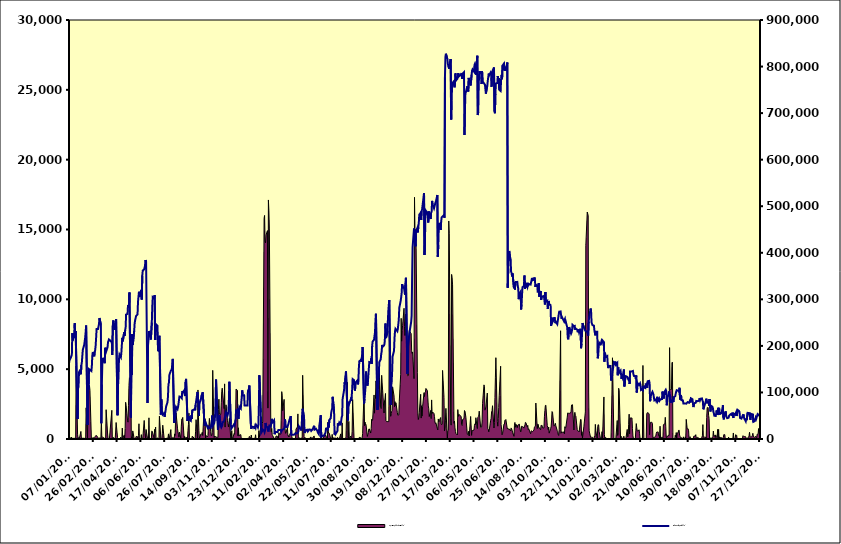
| Category | Deposit Facility (RHS) |
|---|---|
| 31/12/2009 | 162117 |
| 04/01/2010 | 168760 |
| 05/01/2010 | 175174 |
| 06/01/2010 | 176135 |
| 07/01/2010 | 181435 |
| 08/01/2010 | 227141 |
| 11/01/2010 | 211743 |
| 12/01/2010 | 227612 |
| 13/01/2010 | 248874 |
| 14/01/2010 | 217447 |
| 15/01/2010 | 232147 |
| 18/01/2010 | 231439 |
| 19/01/2010 | 42909 |
| 20/01/2010 | 108824 |
| 21/01/2010 | 112060 |
| 22/01/2010 | 143074 |
| 25/01/2010 | 145376 |
| 26/01/2010 | 138953 |
| 27/01/2010 | 158878 |
| 28/01/2010 | 164795 |
| 29/01/2010 | 165261 |
| 01/02/2010 | 191474 |
| 02/02/2010 | 202456 |
| 03/02/2010 | 210273 |
| 04/02/2010 | 217706 |
| 05/02/2010 | 229364 |
| 08/02/2010 | 243711 |
| 09/02/2010 | 29908 |
| 10/02/2010 | 114173 |
| 11/02/2010 | 106587 |
| 12/02/2010 | 150113 |
| 15/02/2010 | 149724 |
| 16/02/2010 | 149724 |
| 17/02/2010 | 146036 |
| 18/02/2010 | 156482 |
| 19/02/2010 | 178934 |
| 20/02/2010 | 186977 |
| 23/02/2010 | 177595 |
| 24/02/2010 | 186103 |
| 25/02/2010 | 190885 |
| 26/02/2010 | 200770 |
| 01/03/2010 | 217292 |
| 02/03/2010 | 236470 |
| 03/03/2010 | 236470 |
| 04/03/2010 | 241774 |
| 05/03/2010 | 246718 |
| 06/03/2010 | 259759 |
| 09/03/2010 | 245483 |
| 10/03/2010 | 33867 |
| 11/03/2010 | 116960 |
| 12/03/2010 | 160313 |
| 15/03/2010 | 172308 |
| 16/03/2010 | 172320 |
| 17/03/2010 | 162805 |
| 18/03/2010 | 196014 |
| 19/03/2010 | 195139 |
| 22/03/2010 | 187838 |
| 23/03/2010 | 197126 |
| 24/03/2010 | 208103 |
| 25/03/2010 | 207308 |
| 26/03/2010 | 213936 |
| 29/03/2010 | 212162 |
| 30/03/2010 | 207952 |
| 31/03/2010 | 180284 |
| 01/04/2010 | 242659 |
| 02/04/2010 | 254701 |
| 07/04/2010 | 234551 |
| 08/04/2010 | 234142 |
| 09/04/2010 | 249292 |
| 10/04/2010 | 257710 |
| 13/04/2010 | 50875 |
| 14/04/2010 | 113660 |
| 15/04/2010 | 132661 |
| 16/04/2010 | 171115 |
| 19/04/2010 | 181469 |
| 20/04/2010 | 175446 |
| 21/04/2010 | 185147 |
| 22/04/2010 | 186741 |
| 23/04/2010 | 217364 |
| 26/04/2010 | 209733 |
| 27/04/2010 | 229501 |
| 28/04/2010 | 221743 |
| 29/04/2010 | 233373 |
| 30/04/2010 | 240120 |
| 03/05/2010 | 267250 |
| 04/05/2010 | 268670 |
| 05/05/2010 | 288019 |
| 06/05/2010 | 290009 |
| 07/05/2010 | 282014 |
| 10/05/2010 | 314792 |
| 11/05/2010 | 46375 |
| 12/05/2010 | 145743 |
| 13/05/2010 | 138058 |
| 14/05/2010 | 225607 |
| 17/05/2010 | 202200 |
| 18/05/2010 | 232148 |
| 19/05/2010 | 248833 |
| 20/05/2010 | 255100 |
| 21/05/2010 | 253469 |
| 24/05/2010 | 264484 |
| 25/05/2010 | 267598 |
| 26/05/2010 | 294533 |
| 27/05/2010 | 305432 |
| 28/05/2010 | 316163 |
| 31/05/2010 | 305232 |
| 01/06/2010 | 316405 |
| 02/06/2010 | 320367 |
| 03/06/2010 | 299471 |
| 04/06/2010 | 350903 |
| 07/06/2010 | 361692 |
| 08/06/2010 | 364587 |
| 09/06/2010 | 368978 |
| 10/06/2010 | 365904 |
| 11/06/2010 | 384260 |
| 14/06/2010 | 381220 |
| 15/06/2010 | 77168 |
| 16/06/2010 | 200733 |
| 17/06/2010 | 213085 |
| 18/06/2010 | 232045 |
| 21/06/2010 | 226129 |
| 22/06/2010 | 213562 |
| 23/06/2010 | 214254 |
| 24/06/2010 | 250019 |
| 25/06/2010 | 284357 |
| 28/06/2010 | 304711 |
| 29/06/2010 | 302228 |
| 30/06/2010 | 309106 |
| 01/07/2010 | 212629 |
| 02/07/2010 | 231717 |
| 05/07/2010 | 246410 |
| 06/07/2010 | 243402 |
| 07/07/2010 | 188405 |
| 08/07/2010 | 190710 |
| 09/07/2010 | 205544 |
| 12/07/2010 | 221922 |
| 13/07/2010 | 52738 |
| 14/07/2010 | 85668 |
| 15/07/2010 | 61659 |
| 16/07/2010 | 58550 |
| 19/07/2010 | 52472 |
| 20/07/2010 | 55069 |
| 21/07/2010 | 47666 |
| 22/07/2010 | 56285 |
| 23/07/2010 | 61325 |
| 26/07/2010 | 69409 |
| 27/07/2010 | 79089 |
| 28/07/2010 | 91307 |
| 29/07/2010 | 117923 |
| 30/07/2010 | 120894 |
| 02/08/2010 | 138117 |
| 03/08/2010 | 146408 |
| 04/08/2010 | 144342 |
| 05/08/2010 | 149973 |
| 06/08/2010 | 161330 |
| 09/08/2010 | 172078 |
| 10/08/2010 | 34495 |
| 11/08/2010 | 38687 |
| 12/08/2010 | 44863 |
| 13/08/2010 | 55585 |
| 16/08/2010 | 68670 |
| 17/08/2010 | 64015 |
| 18/08/2010 | 68326 |
| 19/08/2010 | 74170 |
| 20/08/2010 | 74181 |
| 23/08/2010 | 91219 |
| 24/08/2010 | 90629 |
| 25/08/2010 | 90793 |
| 26/08/2010 | 87863 |
| 27/08/2010 | 102698 |
| 30/08/2010 | 100254 |
| 31/08/2010 | 104262 |
| 01/09/2010 | 95392 |
| 02/09/2010 | 92437 |
| 03/09/2010 | 122440 |
| 06/09/2010 | 129129 |
| 07/09/2010 | 38583 |
| 08/09/2010 | 44328 |
| 09/09/2010 | 40519 |
| 10/09/2010 | 49071 |
| 13/09/2010 | 42081 |
| 14/09/2010 | 39262 |
| 15/09/2010 | 50735 |
| 16/09/2010 | 43216 |
| 17/09/2010 | 61594 |
| 20/09/2010 | 64136 |
| 21/09/2010 | 61566 |
| 22/09/2010 | 73095 |
| 23/09/2010 | 74466 |
| 28/09/2010 | 101047 |
| 29/09/2010 | 101875 |
| 30/09/2010 | 77171 |
| 01/10/2010 | 49471 |
| 04/10/2010 | 76825 |
| 05/10/2010 | 83917 |
| 06/10/2010 | 92164 |
| 07/10/2010 | 94612 |
| 08/10/2010 | 94413 |
| 11/10/2010 | 100580 |
| 12/10/2010 | 44027 |
| 13/10/2010 | 28522 |
| 14/10/2010 | 27970 |
| 15/10/2010 | 35782 |
| 18/10/2010 | 32895 |
| 19/10/2010 | 25115 |
| 20/10/2010 | 28522 |
| 21/10/2010 | 21663 |
| 22/10/2010 | 25657 |
| 25/10/2010 | 23904 |
| 26/10/2010 | 24376 |
| 27/10/2010 | 24567 |
| 28/10/2010 | 37363 |
| 29/10/2010 | 50308 |
| 01/11/2010 | 28128 |
| 02/11/2010 | 33548 |
| 03/11/2010 | 38664 |
| 04/11/2010 | 51480 |
| 05/11/2010 | 81733 |
| 08/11/2010 | 127691 |
| 09/11/2010 | 38910 |
| 10/11/2010 | 19366 |
| 11/11/2010 | 19351 |
| 12/11/2010 | 20210 |
| 15/11/2010 | 51012 |
| 16/11/2010 | 27223 |
| 17/11/2010 | 24934 |
| 18/11/2010 | 23573 |
| 19/11/2010 | 28900 |
| 22/11/2010 | 35868 |
| 23/11/2010 | 38402 |
| 24/11/2010 | 38133 |
| 25/11/2010 | 40179 |
| 26/11/2010 | 53776 |
| 29/11/2010 | 57253 |
| 30/11/2010 | 50222 |
| 01/12/2010 | 48779 |
| 02/12/2010 | 57922 |
| 03/12/2010 | 84850 |
| 06/12/2010 | 122950 |
| 07/12/2010 | 31970 |
| 08/12/2010 | 22077 |
| 09/12/2010 | 23824 |
| 10/12/2010 | 24100 |
| 13/12/2010 | 26975 |
| 14/12/2010 | 31954 |
| 15/12/2010 | 29585 |
| 16/12/2010 | 28500 |
| 17/12/2010 | 40321 |
| 20/12/2010 | 61359 |
| 21/12/2010 | 61191 |
| 22/12/2010 | 65634 |
| 23/12/2010 | 43619 |
| 24/12/2010 | 55371 |
| 27/12/2010 | 69326 |
| 28/12/2010 | 65619 |
| 29/12/2010 | 78863 |
| 30/12/2010 | 88872 |
| 31/12/2010 | 104458 |
| 03/01/2011 | 93415 |
| 04/01/2011 | 93727 |
| 05/01/2011 | 72093 |
| 06/01/2011 | 72093 |
| 07/01/2011 | 72093 |
| 10/01/2011 | 72093 |
| 11/01/2011 | 72093 |
| 12/01/2011 | 103434 |
| 13/01/2011 | 105247 |
| 14/01/2011 | 107200 |
| 17/01/2011 | 115071 |
| 18/01/2011 | 32842 |
| 19/01/2011 | 21539 |
| 20/01/2011 | 26197 |
| 21/01/2011 | 27477 |
| 24/01/2011 | 24842 |
| 25/01/2011 | 25936 |
| 26/01/2011 | 21326 |
| 27/01/2011 | 26859 |
| 28/01/2011 | 24416 |
| 31/01/2011 | 30736 |
| 01/02/2011 | 27303 |
| 02/02/2011 | 25047 |
| 03/02/2011 | 30097 |
| 04/02/2011 | 71446 |
| 07/02/2011 | 137065 |
| 08/02/2011 | 57246 |
| 09/02/2011 | 13584 |
| 10/02/2011 | 14654 |
| 11/02/2011 | 17029 |
| 14/02/2011 | 20492 |
| 15/02/2011 | 17927 |
| 16/02/2011 | 14723 |
| 17/02/2011 | 18761 |
| 18/02/2011 | 34482 |
| 21/02/2011 | 26495 |
| 22/02/2011 | 25476 |
| 23/02/2011 | 18868 |
| 24/02/2011 | 15962 |
| 25/02/2011 | 24718 |
| 28/02/2011 | 28755 |
| 01/03/2011 | 26882 |
| 02/03/2011 | 33847 |
| 03/03/2011 | 43260 |
| 04/03/2011 | 43179 |
| 07/03/2011 | 36212 |
| 08/03/2011 | 40237 |
| 09/03/2011 | 10286 |
| 10/03/2011 | 11713 |
| 11/03/2011 | 15292 |
| 14/03/2011 | 17134 |
| 15/03/2011 | 14756 |
| 16/03/2011 | 16872 |
| 17/03/2011 | 19309 |
| 18/03/2011 | 20150 |
| 21/03/2011 | 20972 |
| 22/03/2011 | 19483 |
| 23/03/2011 | 15585 |
| 24/03/2011 | 16070 |
| 25/03/2011 | 19400 |
| 28/03/2011 | 20923 |
| 29/03/2011 | 22155 |
| 30/03/2011 | 26143 |
| 31/03/2011 | 42085 |
| 01/04/2011 | 26054 |
| 04/04/2011 | 24092 |
| 05/04/2011 | 25680 |
| 06/04/2011 | 25026 |
| 07/04/2011 | 32001 |
| 08/04/2011 | 30522 |
| 11/04/2011 | 40553 |
| 12/04/2011 | 49124 |
| 13/04/2011 | 9176 |
| 14/04/2011 | 8849 |
| 15/04/2011 | 9999 |
| 18/04/2011 | 9474 |
| 19/04/2011 | 9188 |
| 20/04/2011 | 12694 |
| 21/04/2011 | 13104 |
| 26/04/2011 | 12185 |
| 27/04/2011 | 12766 |
| 28/04/2011 | 16299 |
| 29/04/2011 | 27338 |
| 02/05/2011 | 28602 |
| 03/05/2011 | 20951 |
| 04/05/2011 | 18387 |
| 05/05/2011 | 28639 |
| 06/05/2011 | 54244 |
| 09/05/2011 | 64965 |
| 10/05/2011 | 44567 |
| 11/05/2011 | 13091 |
| 12/05/2011 | 11993 |
| 13/05/2011 | 12106 |
| 16/05/2011 | 19333 |
| 17/05/2011 | 19991 |
| 18/05/2011 | 16460 |
| 19/05/2011 | 15174 |
| 20/05/2011 | 17801 |
| 23/05/2011 | 20441 |
| 24/05/2011 | 19842 |
| 25/05/2011 | 17520 |
| 26/05/2011 | 15627 |
| 27/05/2011 | 19382 |
| 30/05/2011 | 20886 |
| 31/05/2011 | 28340 |
| 01/06/2011 | 20174 |
| 02/06/2011 | 20229 |
| 03/06/2011 | 20425 |
| 06/06/2011 | 22074 |
| 07/06/2011 | 17289 |
| 08/06/2011 | 13642 |
| 09/06/2011 | 12085 |
| 10/06/2011 | 10409 |
| 13/06/2011 | 28261 |
| 14/06/2011 | 51111 |
| 15/06/2011 | 4981 |
| 16/06/2011 | 5109 |
| 17/06/2011 | 5371 |
| 20/06/2011 | 6794 |
| 21/06/2011 | 7194 |
| 22/06/2011 | 9977 |
| 23/06/2011 | 11405 |
| 24/06/2011 | 13189 |
| 27/06/2011 | 22371 |
| 28/06/2011 | 23365 |
| 29/06/2011 | 18793 |
| 30/06/2011 | 34561 |
| 01/07/2011 | 24902 |
| 04/07/2011 | 40847 |
| 05/07/2011 | 44674 |
| 06/07/2011 | 57043 |
| 07/07/2011 | 61426 |
| 08/07/2011 | 65687 |
| 11/07/2011 | 90544 |
| 12/07/2011 | 60429 |
| 13/07/2011 | 9507 |
| 14/07/2011 | 13263 |
| 15/07/2011 | 10254 |
| 18/07/2011 | 11655 |
| 19/07/2011 | 17160 |
| 20/07/2011 | 33868 |
| 21/07/2011 | 28679 |
| 22/07/2011 | 32167 |
| 25/07/2011 | 35595 |
| 26/07/2011 | 31789 |
| 27/07/2011 | 39099 |
| 28/07/2011 | 46977 |
| 29/07/2011 | 49867 |
| 01/08/2011 | 86605 |
| 02/08/2011 | 104889 |
| 03/08/2011 | 121740 |
| 04/08/2011 | 117763 |
| 05/08/2011 | 134825 |
| 08/08/2011 | 145217 |
| 09/08/2011 | 62514 |
| 10/08/2011 | 39561 |
| 11/08/2011 | 67044 |
| 12/08/2011 | 80214 |
| 15/08/2011 | 76443 |
| 16/08/2011 | 84852 |
| 17/08/2011 | 82194 |
| 18/08/2011 | 90523 |
| 19/08/2011 | 105911 |
| 22/08/2011 | 128719 |
| 23/08/2011 | 126358 |
| 24/08/2011 | 110434 |
| 25/08/2011 | 103977 |
| 26/08/2011 | 121190 |
| 29/08/2011 | 120319 |
| 30/08/2011 | 125760 |
| 31/08/2011 | 117352 |
| 01/09/2011 | 120956 |
| 02/09/2011 | 151097 |
| 05/09/2011 | 166848 |
| 06/09/2011 | 169640 |
| 07/09/2011 | 166118 |
| 08/09/2011 | 172864 |
| 09/09/2011 | 181788 |
| 12/09/2011 | 197750 |
| 13/09/2011 | 75529 |
| 14/09/2011 | 85952 |
| 15/09/2011 | 97990 |
| 16/09/2011 | 111514 |
| 19/09/2011 | 144806 |
| 20/09/2011 | 114721 |
| 21/09/2011 | 121445 |
| 22/09/2011 | 136545 |
| 23/09/2011 | 150651 |
| 26/09/2011 | 165118 |
| 27/09/2011 | 164127 |
| 28/09/2011 | 173239 |
| 29/09/2011 | 161415 |
| 30/09/2011 | 199639 |
| 03/10/2011 | 209275 |
| 04/10/2011 | 213206 |
| 05/10/2011 | 221353 |
| 06/10/2011 | 229003 |
| 07/10/2011 | 255569 |
| 10/10/2011 | 269228 |
| 11/10/2011 | 62224 |
| 12/10/2011 | 105460 |
| 13/10/2011 | 123195 |
| 14/10/2011 | 136194 |
| 17/10/2011 | 164966 |
| 18/10/2011 | 171065 |
| 19/10/2011 | 181867 |
| 20/10/2011 | 188142 |
| 21/10/2011 | 202098 |
| 24/10/2011 | 198014 |
| 25/10/2011 | 200946 |
| 26/10/2011 | 204439 |
| 27/10/2011 | 218106 |
| 28/10/2011 | 248057 |
| 31/10/2011 | 216878 |
| 01/11/2011 | 229066 |
| 02/11/2011 | 252953 |
| 03/11/2011 | 275226 |
| 04/11/2011 | 288429 |
| 07/11/2011 | 298591 |
| 08/11/2011 | 73189 |
| 09/11/2011 | 113825 |
| 10/11/2011 | 122745 |
| 11/11/2011 | 144701 |
| 14/11/2011 | 177237 |
| 15/11/2011 | 189827 |
| 16/11/2011 | 216295 |
| 17/11/2011 | 230899 |
| 18/11/2011 | 236781 |
| 21/11/2011 | 235412 |
| 22/11/2011 | 231429 |
| 23/11/2011 | 236590 |
| 24/11/2011 | 237411 |
| 25/11/2011 | 256259 |
| 28/11/2011 | 281418 |
| 29/11/2011 | 297112 |
| 30/11/2011 | 304418 |
| 01/12/2011 | 313763 |
| 02/12/2011 | 332705 |
| 05/12/2011 | 328172 |
| 06/12/2011 | 324587 |
| 07/12/2011 | 324505 |
| 08/12/2011 | 310061 |
| 09/12/2011 | 334905 |
| 12/12/2011 | 346357 |
| 13/12/2011 | 140307 |
| 14/12/2011 | 197056 |
| 15/12/2011 | 196270 |
| 16/12/2011 | 214108 |
| 19/12/2011 | 225548 |
| 20/12/2011 | 251350 |
| 21/12/2011 | 264969 |
| 22/12/2011 | 346994 |
| 23/12/2011 | 411813 |
| 27/12/2011 | 452034 |
| 28/12/2011 | 436583 |
| 29/12/2011 | 445683 |
| 30/12/2011 | 413882 |
| 02/01/2012 | 446262 |
| 03/01/2012 | 453181 |
| 04/01/2012 | 443701 |
| 05/01/2012 | 455299 |
| 06/01/2012 | 463565 |
| 09/01/2012 | 481935 |
| 10/01/2012 | 485898 |
| 11/01/2012 | 470632 |
| 12/01/2012 | 489906 |
| 13/01/2012 | 493272 |
| 16/01/2012 | 501933 |
| 17/01/2012 | 528184 |
| 18/01/2012 | 395327 |
| 19/01/2012 | 420949 |
| 20/01/2012 | 491780 |
| 23/01/2012 | 490546 |
| 24/01/2012 | 485785 |
| 25/01/2012 | 484125 |
| 26/01/2012 | 464848 |
| 27/01/2012 | 488884 |
| 30/01/2012 | 479441 |
| 31/01/2012 | 472456 |
| 01/02/2012 | 486365 |
| 02/02/2012 | 488689 |
| 03/02/2012 | 511438 |
| 06/02/2012 | 503388 |
| 07/02/2012 | 495351 |
| 08/02/2012 | 494726 |
| 09/02/2012 | 496108 |
| 10/02/2012 | 507876 |
| 13/02/2012 | 510234 |
| 14/02/2012 | 524044 |
| 15/02/2012 | 391550 |
| 16/02/2012 | 416738 |
| 17/02/2012 | 454356 |
| 20/02/2012 | 464186 |
| 21/02/2012 | 449052 |
| 22/02/2012 | 466403 |
| 23/02/2012 | 475856 |
| 24/02/2012 | 477324 |
| 27/02/2012 | 475240 |
| 28/02/2012 | 481144 |
| 29/02/2012 | 475219 |
| 01/03/2012 | 776941 |
| 02/03/2012 | 820819 |
| 05/03/2012 | 827534 |
| 06/03/2012 | 816759 |
| 07/03/2012 | 806953 |
| 08/03/2012 | 800573 |
| 09/03/2012 | 797953 |
| 12/03/2012 | 795166 |
| 13/03/2012 | 815986 |
| 14/03/2012 | 686426 |
| 15/03/2012 | 727736 |
| 16/03/2012 | 758754 |
| 19/03/2012 | 765160 |
| 20/03/2012 | 768862 |
| 21/03/2012 | 755335 |
| 22/03/2012 | 763288 |
| 23/03/2012 | 785393 |
| 26/03/2012 | 769752 |
| 27/03/2012 | 773687 |
| 28/03/2012 | 777163 |
| 29/03/2012 | 786013 |
| 30/03/2012 | 778702 |
| 02/04/2012 | 782855 |
| 03/04/2012 | 786240 |
| 04/04/2012 | 773364 |
| 05/04/2012 | 784829 |
| 10/04/2012 | 787959 |
| 11/04/2012 | 652943 |
| 12/04/2012 | 705625 |
| 13/04/2012 | 742825 |
| 16/04/2012 | 745178 |
| 17/04/2012 | 757828 |
| 18/04/2012 | 756721 |
| 19/04/2012 | 746466 |
| 20/04/2012 | 775650 |
| 23/04/2012 | 767804 |
| 24/04/2012 | 759324 |
| 25/04/2012 | 782336 |
| 26/04/2012 | 791315 |
| 27/04/2012 | 793958 |
| 30/04/2012 | 789277 |
| 02/05/2012 | 803064 |
| 03/05/2012 | 805701 |
| 04/05/2012 | 801489 |
| 07/05/2012 | 782306 |
| 08/05/2012 | 823293 |
| 09/05/2012 | 695845 |
| 10/05/2012 | 702734 |
| 11/05/2012 | 763119 |
| 14/05/2012 | 788181 |
| 15/05/2012 | 788371 |
| 16/05/2012 | 785137 |
| 17/05/2012 | 762427 |
| 18/05/2012 | 789715 |
| 21/05/2012 | 768250 |
| 22/05/2012 | 764033 |
| 23/05/2012 | 765931 |
| 24/05/2012 | 760988 |
| 25/05/2012 | 760102 |
| 28/05/2012 | 741856 |
| 29/05/2012 | 759687 |
| 30/05/2012 | 769642 |
| 31/05/2012 | 769306 |
| 01/06/2012 | 784973 |
| 04/06/2012 | 781499 |
| 05/06/2012 | 787256 |
| 06/06/2012 | 784624 |
| 07/06/2012 | 756573 |
| 08/06/2012 | 788218 |
| 11/06/2012 | 787428 |
| 12/06/2012 | 798179 |
| 13/06/2012 | 703532 |
| 14/06/2012 | 699633 |
| 15/06/2012 | 741191 |
| 18/06/2012 | 763564 |
| 19/06/2012 | 764455 |
| 20/06/2012 | 779764 |
| 21/06/2012 | 769056 |
| 22/06/2012 | 775263 |
| 25/06/2012 | 750196 |
| 26/06/2012 | 747432 |
| 27/06/2012 | 772588 |
| 28/06/2012 | 782238 |
| 29/06/2012 | 772855 |
| 02/07/2012 | 802138 |
| 03/07/2012 | 806518 |
| 04/07/2012 | 790982 |
| 05/07/2012 | 790656 |
| 06/07/2012 | 795203 |
| 09/07/2012 | 791248 |
| 10/07/2012 | 808516 |
| 11/07/2012 | 324931 |
| 12/07/2012 | 366180 |
| 13/07/2012 | 386826 |
| 16/07/2012 | 403944 |
| 17/07/2012 | 382004 |
| 18/07/2012 | 359626 |
| 19/07/2012 | 356821 |
| 20/07/2012 | 349434 |
| 23/07/2012 | 355881 |
| 24/07/2012 | 324084 |
| 25/07/2012 | 337073 |
| 26/07/2012 | 321034 |
| 27/07/2012 | 337025 |
| 30/07/2012 | 335731 |
| 31/07/2012 | 337467 |
| 01/08/2012 | 328282 |
| 02/08/2012 | 323608 |
| 03/08/2012 | 300384 |
| 06/08/2012 | 311714 |
| 07/08/2012 | 316658 |
| 08/08/2012 | 278045 |
| 09/08/2012 | 289199 |
| 10/08/2012 | 310822 |
| 13/08/2012 | 326167 |
| 14/08/2012 | 329038 |
| 15/08/2012 | 351176 |
| 16/08/2012 | 322480 |
| 17/08/2012 | 326920 |
| 20/08/2012 | 333373 |
| 21/08/2012 | 326505 |
| 22/08/2012 | 335506 |
| 23/08/2012 | 329916 |
| 24/08/2012 | 329348 |
| 27/08/2012 | 332740 |
| 28/08/2012 | 331841 |
| 29/08/2012 | 333565 |
| 30/08/2012 | 330306 |
| 31/08/2012 | 345956 |
| 03/09/2012 | 341001 |
| 04/09/2012 | 342050 |
| 05/09/2012 | 347014 |
| 06/09/2012 | 342420 |
| 07/09/2012 | 326804 |
| 10/09/2012 | 330906 |
| 11/09/2012 | 330065 |
| 12/09/2012 | 314958 |
| 13/09/2012 | 319841 |
| 14/09/2012 | 335048 |
| 17/09/2012 | 305815 |
| 18/09/2012 | 318040 |
| 19/09/2012 | 298812 |
| 20/09/2012 | 302204 |
| 21/09/2012 | 305647 |
| 24/09/2012 | 303915 |
| 25/09/2012 | 307346 |
| 26/09/2012 | 308154 |
| 27/09/2012 | 288868 |
| 28/09/2012 | 315754 |
| 01/10/2012 | 294862 |
| 02/10/2012 | 296891 |
| 03/10/2012 | 279315 |
| 04/10/2012 | 277772 |
| 05/10/2012 | 296464 |
| 08/10/2012 | 290077 |
| 09/10/2012 | 287434 |
| 10/10/2012 | 242931 |
| 11/10/2012 | 243170 |
| 12/10/2012 | 260477 |
| 15/10/2012 | 251358 |
| 16/10/2012 | 257880 |
| 17/10/2012 | 261617 |
| 18/10/2012 | 256452 |
| 19/10/2012 | 248711 |
| 22/10/2012 | 251571 |
| 23/10/2012 | 246684 |
| 24/10/2012 | 245073 |
| 25/10/2012 | 248538 |
| 26/10/2012 | 266967 |
| 29/10/2012 | 273454 |
| 30/10/2012 | 274050 |
| 31/10/2012 | 274049 |
| 01/11/2012 | 258289 |
| 02/11/2012 | 261368 |
| 05/11/2012 | 261414 |
| 06/11/2012 | 253101 |
| 07/11/2012 | 255687 |
| 08/11/2012 | 257847 |
| 09/11/2012 | 248511 |
| 12/11/2012 | 251564 |
| 13/11/2012 | 239450 |
| 14/11/2012 | 217727 |
| 15/11/2012 | 214094 |
| 16/11/2012 | 215900 |
| 19/11/2012 | 240454 |
| 20/11/2012 | 229689 |
| 21/11/2012 | 226332 |
| 22/11/2012 | 228821 |
| 23/11/2012 | 233558 |
| 26/11/2012 | 245197 |
| 27/11/2012 | 241913 |
| 28/11/2012 | 244982 |
| 29/11/2012 | 234999 |
| 30/11/2012 | 237813 |
| 03/12/2012 | 239440 |
| 04/12/2012 | 234755 |
| 05/12/2012 | 229295 |
| 06/12/2012 | 229967 |
| 07/12/2012 | 235296 |
| 10/12/2012 | 229013 |
| 11/12/2012 | 236660 |
| 12/12/2012 | 195147 |
| 13/12/2012 | 204382 |
| 14/12/2012 | 225063 |
| 17/12/2012 | 249007 |
| 18/12/2012 | 239109 |
| 19/12/2012 | 232556 |
| 20/12/2012 | 231450 |
| 21/12/2012 | 229384 |
| 24/12/2012 | 221623 |
| 27/12/2012 | 252030 |
| 28/12/2012 | 261689 |
| 31/12/2012 | 280219 |
| 02/01/2013 | 275943 |
| 03/01/2013 | 250478 |
| 04/01/2013 | 252615 |
| 07/01/2013 | 244528 |
| 08/01/2013 | 243475 |
| 09/01/2013 | 233586 |
| 10/01/2013 | 231520 |
| 11/01/2013 | 222608 |
| 14/01/2013 | 230533 |
| 15/01/2013 | 230532 |
| 16/01/2013 | 173298 |
| 17/01/2013 | 179106 |
| 18/01/2013 | 196399 |
| 21/01/2013 | 207058 |
| 22/01/2013 | 203612 |
| 23/01/2013 | 206832 |
| 24/01/2013 | 210290 |
| 25/01/2013 | 207198 |
| 28/01/2013 | 211782 |
| 29/01/2013 | 208093 |
| 30/01/2013 | 165846 |
| 31/01/2013 | 185346 |
| 01/02/2013 | 180957 |
| 04/02/2013 | 176170 |
| 05/02/2013 | 178012 |
| 06/02/2013 | 162082 |
| 07/02/2013 | 152286 |
| 08/02/2013 | 157198 |
| 11/02/2013 | 159193 |
| 12/02/2013 | 156853 |
| 13/02/2013 | 125613 |
| 14/02/2013 | 124279 |
| 15/02/2013 | 131885 |
| 18/02/2013 | 143519 |
| 19/02/2013 | 164510 |
| 20/02/2013 | 165318 |
| 21/02/2013 | 162244 |
| 22/02/2013 | 166437 |
| 25/02/2013 | 159760 |
| 26/02/2013 | 163356 |
| 27/02/2013 | 136737 |
| 28/02/2013 | 153707 |
| 01/03/2013 | 144710 |
| 04/03/2013 | 142054 |
| 05/03/2013 | 146646 |
| 06/03/2013 | 139396 |
| 07/03/2013 | 129139 |
| 08/03/2013 | 134083 |
| 11/03/2013 | 131597 |
| 12/03/2013 | 149351 |
| 13/03/2013 | 112914 |
| 14/03/2013 | 117834 |
| 15/03/2013 | 132634 |
| 18/03/2013 | 134961 |
| 19/03/2013 | 133562 |
| 20/03/2013 | 130534 |
| 21/03/2013 | 132196 |
| 22/03/2013 | 126755 |
| 25/03/2013 | 128934 |
| 26/03/2013 | 118182 |
| 27/03/2013 | 145036 |
| 28/03/2013 | 144876 |
| 29/03/2013 | 144876 |
| 30/03/2013 | 144876 |
| 31/03/2013 | 144876 |
| 01/04/2013 | 144876 |
| 02/04/2013 | 146175 |
| 03/04/2013 | 139245 |
| 04/04/2013 | 135500 |
| 05/04/2013 | 134902 |
| 06/04/2013 | 134902 |
| 07/04/2013 | 134902 |
| 08/04/2013 | 129510 |
| 09/04/2013 | 136326 |
| 10/04/2013 | 99935 |
| 11/04/2013 | 108854 |
| 12/04/2013 | 119906 |
| 13/04/2013 | 119906 |
| 14/04/2013 | 119906 |
| 15/04/2013 | 116204 |
| 16/04/2013 | 115237 |
| 17/04/2013 | 119557 |
| 18/04/2013 | 115131 |
| 19/04/2013 | 105590 |
| 20/04/2013 | 105590 |
| 21/04/2013 | 105590 |
| 22/04/2013 | 108247 |
| 23/04/2013 | 102413 |
| 24/04/2013 | 114079 |
| 25/04/2013 | 111473 |
| 26/04/2013 | 109662 |
| 27/04/2013 | 109662 |
| 28/04/2013 | 109662 |
| 29/04/2013 | 119131 |
| 30/04/2013 | 120832 |
| 01/05/2013 | 120832 |
| 02/05/2013 | 110171 |
| 03/05/2013 | 124102 |
| 04/05/2013 | 124102 |
| 05/05/2013 | 124102 |
| 06/05/2013 | 124856 |
| 07/05/2013 | 120445 |
| 08/05/2013 | 81141 |
| 09/05/2013 | 86469 |
| 10/05/2013 | 95339 |
| 11/05/2013 | 95339 |
| 12/05/2013 | 95339 |
| 13/05/2013 | 101419 |
| 14/05/2013 | 101540 |
| 15/05/2013 | 96065 |
| 16/05/2013 | 96651 |
| 17/05/2013 | 83039 |
| 18/05/2013 | 83039 |
| 19/05/2013 | 83039 |
| 20/05/2013 | 84993 |
| 21/05/2013 | 81757 |
| 22/05/2013 | 84406 |
| 23/05/2013 | 90637 |
| 24/05/2013 | 81037 |
| 25/05/2013 | 81037 |
| 26/05/2013 | 81037 |
| 27/05/2013 | 86808 |
| 28/05/2013 | 82449 |
| 29/05/2013 | 82393 |
| 30/05/2013 | 85560 |
| 31/05/2013 | 85640 |
| 01/06/2013 | 85640 |
| 02/06/2013 | 85640 |
| 03/06/2013 | 101898 |
| 04/06/2013 | 101354 |
| 05/06/2013 | 89550 |
| 06/06/2013 | 86872 |
| 07/06/2013 | 100881 |
| 08/06/2013 | 100881 |
| 09/06/2013 | 100881 |
| 10/06/2013 | 105856 |
| 11/06/2013 | 102979 |
| 12/06/2013 | 72417 |
| 13/06/2013 | 82127 |
| 14/06/2013 | 89957 |
| 15/06/2013 | 89957 |
| 16/06/2013 | 89957 |
| 17/06/2013 | 101967 |
| 18/06/2013 | 91609 |
| 19/06/2013 | 95059 |
| 20/06/2013 | 77865 |
| 21/06/2013 | 82964 |
| 22/06/2013 | 82964 |
| 23/06/2013 | 82964 |
| 24/06/2013 | 79727 |
| 25/06/2013 | 83195 |
| 26/06/2013 | 79828 |
| 27/06/2013 | 90088 |
| 28/06/2013 | 92180 |
| 29/06/2013 | 92180 |
| 30/06/2013 | 92180 |
| 01/07/2013 | 98503 |
| 02/07/2013 | 100158 |
| 03/07/2013 | 104748 |
| 04/07/2013 | 103690 |
| 05/07/2013 | 103862 |
| 06/07/2013 | 103862 |
| 07/07/2013 | 103862 |
| 08/07/2013 | 101463 |
| 09/07/2013 | 109964 |
| 10/07/2013 | 84850 |
| 11/07/2013 | 86404 |
| 12/07/2013 | 94619 |
| 13/07/2013 | 83407 |
| 14/07/2013 | 84881 |
| 15/07/2013 | 83893 |
| 16/07/2013 | 82864 |
| 17/07/2013 | 76431 |
| 18/07/2013 | 78308 |
| 19/07/2013 | 76431 |
| 20/07/2013 | 76431 |
| 21/07/2013 | 76431 |
| 22/07/2013 | 78308 |
| 23/07/2013 | 75946 |
| 24/07/2013 | 74375 |
| 25/07/2013 | 76438 |
| 26/07/2013 | 79242 |
| 27/07/2013 | 79242 |
| 28/07/2013 | 79242 |
| 29/07/2013 | 77868 |
| 30/07/2013 | 79734 |
| 31/07/2013 | 82647 |
| 01/08/2013 | 78494 |
| 02/08/2013 | 87348 |
| 03/08/2013 | 87348 |
| 04/08/2013 | 87348 |
| 05/08/2013 | 85430 |
| 06/08/2013 | 84904 |
| 07/08/2013 | 68612 |
| 08/08/2013 | 70146 |
| 09/08/2013 | 76997 |
| 10/08/2013 | 76997 |
| 11/08/2013 | 76997 |
| 12/08/2013 | 77846 |
| 13/08/2013 | 81779 |
| 14/08/2013 | 83057 |
| 15/08/2013 | 81111 |
| 16/08/2013 | 81202 |
| 17/08/2013 | 81202 |
| 18/08/2013 | 81202 |
| 19/08/2013 | 82159 |
| 20/08/2013 | 87432 |
| 21/08/2013 | 83553 |
| 22/08/2013 | 86477 |
| 23/08/2013 | 87224 |
| 24/08/2013 | 87224 |
| 25/08/2013 | 87224 |
| 26/08/2013 | 82731 |
| 27/08/2013 | 80358 |
| 28/08/2013 | 63846 |
| 29/08/2013 | 66410 |
| 30/08/2013 | 70569 |
| 31/08/2013 | 70569 |
| 01/09/2013 | 70569 |
| 02/09/2013 | 80526 |
| 03/09/2013 | 86536 |
| 04/09/2013 | 86055 |
| 05/09/2013 | 78182 |
| 06/09/2013 | 79934 |
| 07/09/2013 | 79934 |
| 08/09/2013 | 79934 |
| 09/09/2013 | 71223 |
| 10/09/2013 | 86028 |
| 11/09/2013 | 68560 |
| 12/09/2013 | 59152 |
| 13/09/2013 | 71425 |
| 14/09/2013 | 71425 |
| 15/09/2013 | 71425 |
| 16/09/2013 | 69358 |
| 17/09/2013 | 66467 |
| 18/09/2013 | 58754 |
| 19/09/2013 | 55384 |
| 20/09/2013 | 50060 |
| 21/09/2013 | 50060 |
| 22/09/2013 | 50060 |
| 23/09/2013 | 49492 |
| 24/09/2013 | 48855 |
| 25/09/2013 | 61330 |
| 26/09/2013 | 51499 |
| 27/09/2013 | 52870 |
| 28/09/2013 | 66856 |
| 29/09/2013 | 52679 |
| 30/09/2013 | 66856 |
| 01/10/2013 | 52679 |
| 02/10/2013 | 55741 |
| 03/10/2013 | 57218 |
| 04/10/2013 | 55336 |
| 05/10/2013 | 55336 |
| 06/10/2013 | 55336 |
| 07/10/2013 | 65582 |
| 08/10/2013 | 72318 |
| 09/10/2013 | 46158 |
| 10/10/2013 | 42088 |
| 11/10/2013 | 52553 |
| 12/10/2013 | 52553 |
| 13/10/2013 | 52553 |
| 14/10/2013 | 59353 |
| 15/10/2013 | 48269 |
| 16/10/2013 | 46818 |
| 17/10/2013 | 44750 |
| 18/10/2013 | 45667 |
| 19/10/2013 | 45667 |
| 20/10/2013 | 45667 |
| 21/10/2013 | 49880 |
| 22/10/2013 | 48828 |
| 23/10/2013 | 50165 |
| 24/10/2013 | 53232 |
| 25/10/2013 | 51336 |
| 26/10/2013 | 51336 |
| 27/10/2013 | 51336 |
| 28/10/2013 | 56708 |
| 29/10/2013 | 50530 |
| 30/10/2013 | 45135 |
| 31/10/2013 | 54141 |
| 01/11/2013 | 52127 |
| 02/11/2013 | 52127 |
| 03/11/2013 | 52127 |
| 04/11/2013 | 55539 |
| 05/11/2013 | 57848 |
| 06/11/2013 | 49538 |
| 07/11/2013 | 54659 |
| 08/11/2013 | 62442 |
| 09/11/2013 | 62442 |
| 10/11/2013 | 62442 |
| 11/11/2013 | 60176 |
| 12/11/2013 | 57525 |
| 13/11/2013 | 45432 |
| 14/11/2013 | 46440 |
| 15/11/2013 | 43861 |
| 16/11/2013 | 43861 |
| 17/11/2013 | 43861 |
| 18/11/2013 | 48698 |
| 19/11/2013 | 46041 |
| 20/11/2013 | 52652 |
| 21/11/2013 | 48158 |
| 22/11/2013 | 44039 |
| 23/11/2013 | 44039 |
| 24/11/2013 | 44039 |
| 25/11/2013 | 38027 |
| 26/11/2013 | 44022 |
| 27/11/2013 | 40511 |
| 28/11/2013 | 40844 |
| 29/11/2013 | 56147 |
| 30/11/2013 | 56147 |
| 01/12/2013 | 56147 |
| 02/12/2013 | 55675 |
| 03/12/2013 | 56076 |
| 04/12/2013 | 48134 |
| 05/12/2013 | 41292 |
| 06/12/2013 | 54069 |
| 07/12/2013 | 54069 |
| 08/12/2013 | 54069 |
| 09/12/2013 | 52207 |
| 10/12/2013 | 54375 |
| 11/12/2013 | 36897 |
| 12/12/2013 | 36971 |
| 13/12/2013 | 38341 |
| 14/12/2013 | 38341 |
| 15/12/2013 | 38341 |
| 16/12/2013 | 45841 |
| 17/12/2013 | 43276 |
| 18/12/2013 | 43991 |
| 19/12/2013 | 43761 |
| 20/12/2013 | 53345 |
| 21/12/2013 | 53345 |
| 22/12/2013 | 53345 |
| 23/12/2013 | 50604 |
| 24/12/2013 | 54445 |
| 25/12/2013 | 54445 |
| 26/12/2013 | 54445 |
| 27/12/2013 | 59628 |
| 28/12/2013 | 59628 |
| 29/12/2013 | 59628 |